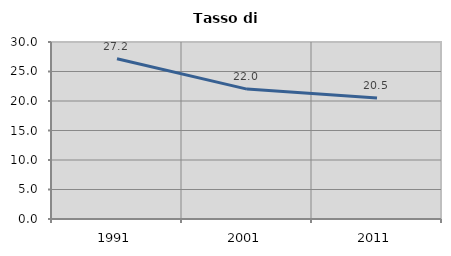
| Category | Tasso di disoccupazione   |
|---|---|
| 1991.0 | 27.155 |
| 2001.0 | 22.014 |
| 2011.0 | 20.513 |